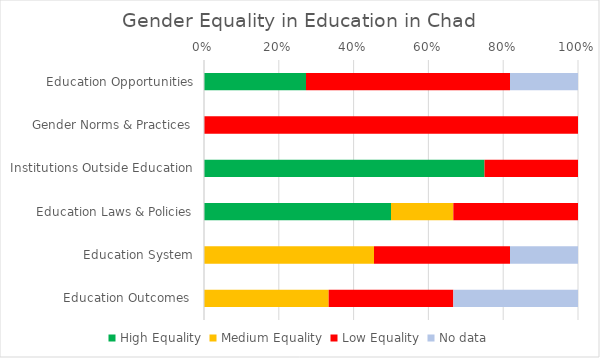
| Category | High Equality | Medium Equality | Low Equality | No data |
|---|---|---|---|---|
| Education Opportunities | 3 | 0 | 6 | 2 |
| Gender Norms & Practices | 0 | 0 | 4 | 0 |
| Institutions Outside Education | 3 | 0 | 1 | 0 |
| Education Laws & Policies | 3 | 1 | 2 | 0 |
| Education System | 0 | 5 | 4 | 2 |
| Education Outcomes  | 0 | 1 | 1 | 1 |